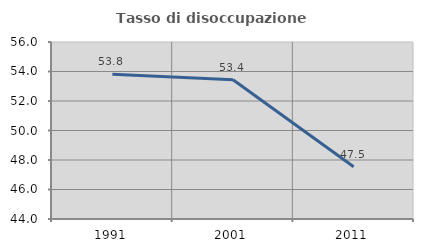
| Category | Tasso di disoccupazione giovanile  |
|---|---|
| 1991.0 | 53.815 |
| 2001.0 | 53.435 |
| 2011.0 | 47.541 |